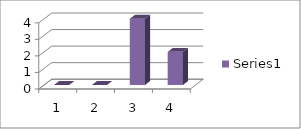
| Category | Series 0 |
|---|---|
| 0 | 0 |
| 1 | 0 |
| 2 | 4 |
| 3 | 2 |